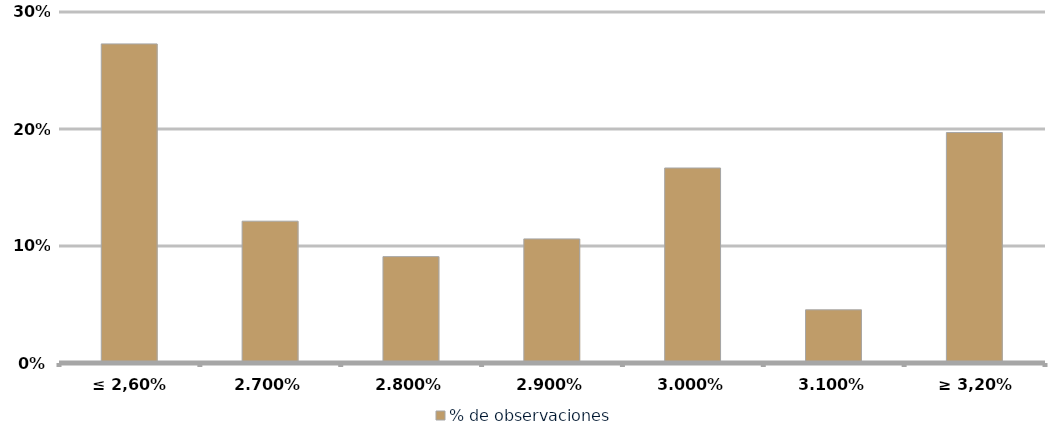
| Category | % de observaciones  |
|---|---|
| ≤ 2,60% | 0.273 |
| 2,70% | 0.121 |
| 2,80% | 0.091 |
| 2,90% | 0.106 |
| 3,00% | 0.167 |
| 3,10% | 0.045 |
| ≥ 3,20% | 0.197 |